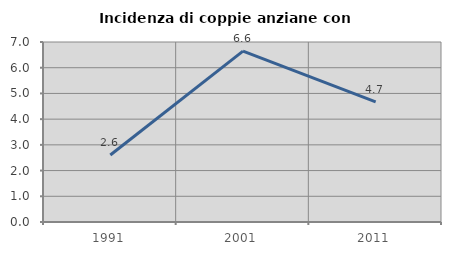
| Category | Incidenza di coppie anziane con figli |
|---|---|
| 1991.0 | 2.608 |
| 2001.0 | 6.644 |
| 2011.0 | 4.668 |